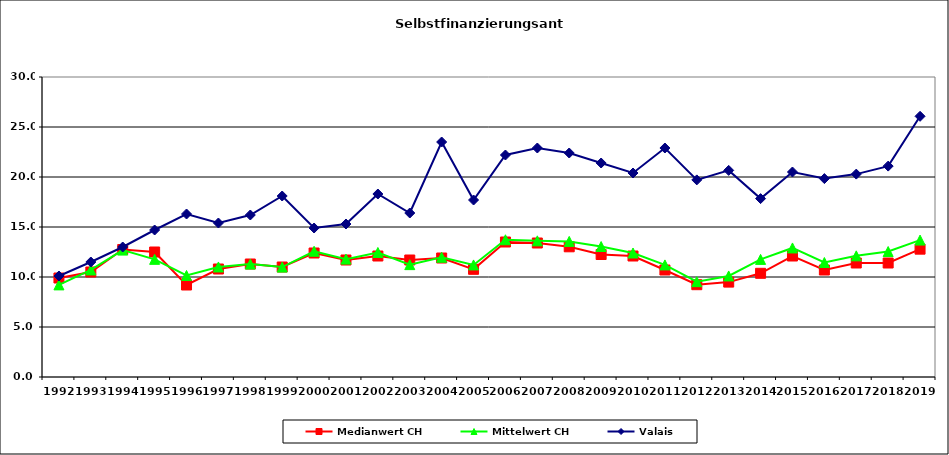
| Category | Medianwert CH | Mittelwert CH | Valais |
|---|---|---|---|
| 1992.0 | 9.9 | 9.211 | 10.1 |
| 1993.0 | 10.5 | 10.706 | 11.5 |
| 1994.0 | 12.75 | 12.69 | 13 |
| 1995.0 | 12.5 | 11.765 | 14.7 |
| 1996.0 | 9.2 | 10.152 | 16.3 |
| 1997.0 | 10.8 | 11.005 | 15.4 |
| 1998.0 | 11.3 | 11.291 | 16.2 |
| 1999.0 | 11 | 10.991 | 18.1 |
| 2000.0 | 12.4 | 12.575 | 14.9 |
| 2001.0 | 11.7 | 11.788 | 15.3 |
| 2002.0 | 12.1 | 12.452 | 18.3 |
| 2003.0 | 11.7 | 11.236 | 16.4 |
| 2004.0 | 11.9 | 11.971 | 23.5 |
| 2005.0 | 10.768 | 11.206 | 17.7 |
| 2006.0 | 13.5 | 13.724 | 22.2 |
| 2007.0 | 13.4 | 13.616 | 22.9 |
| 2008.0 | 13.02 | 13.561 | 22.4 |
| 2009.0 | 12.25 | 13.048 | 21.4 |
| 2010.0 | 12.1 | 12.4 | 20.4 |
| 2011.0 | 10.7 | 11.209 | 22.9 |
| 2012.0 | 9.23 | 9.534 | 19.71 |
| 2013.0 | 9.49 | 10.106 | 20.66 |
| 2014.0 | 10.37 | 11.762 | 17.84 |
| 2015.0 | 12.1 | 12.906 | 20.5 |
| 2016.0 | 10.7 | 11.448 | 19.84 |
| 2017.0 | 11.4 | 12.116 | 20.29 |
| 2018.0 | 11.4 | 12.546 | 21.09 |
| 2019.0 | 12.784 | 13.693 | 26.07 |